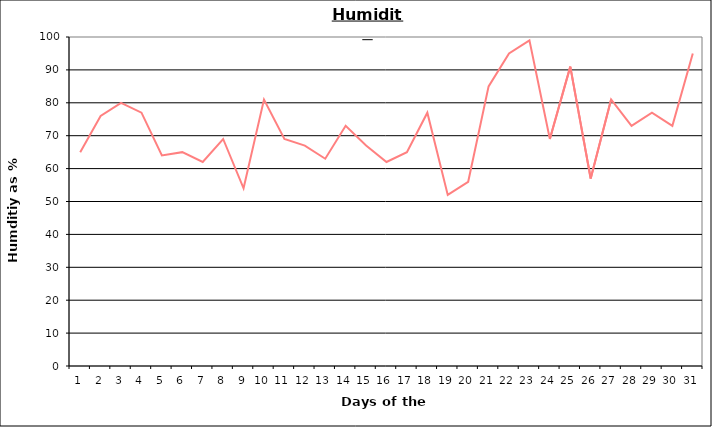
| Category | Series 0 |
|---|---|
| 0 | 65 |
| 1 | 76 |
| 2 | 80 |
| 3 | 77 |
| 4 | 64 |
| 5 | 65 |
| 6 | 62 |
| 7 | 69 |
| 8 | 54 |
| 9 | 81 |
| 10 | 69 |
| 11 | 67 |
| 12 | 63 |
| 13 | 73 |
| 14 | 67 |
| 15 | 62 |
| 16 | 65 |
| 17 | 77 |
| 18 | 52 |
| 19 | 56 |
| 20 | 85 |
| 21 | 95 |
| 22 | 99 |
| 23 | 69 |
| 24 | 91 |
| 25 | 57 |
| 26 | 81 |
| 27 | 73 |
| 28 | 77 |
| 29 | 73 |
| 30 | 95 |